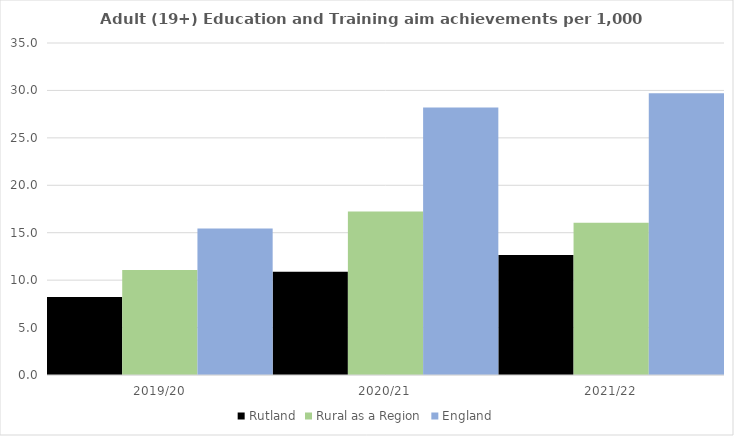
| Category | Rutland | Rural as a Region | England |
|---|---|---|---|
| 2019/20 | 8.234 | 11.081 | 15.446 |
| 2020/21 | 10.882 | 17.224 | 28.211 |
| 2021/22 | 12.639 | 16.063 | 29.711 |